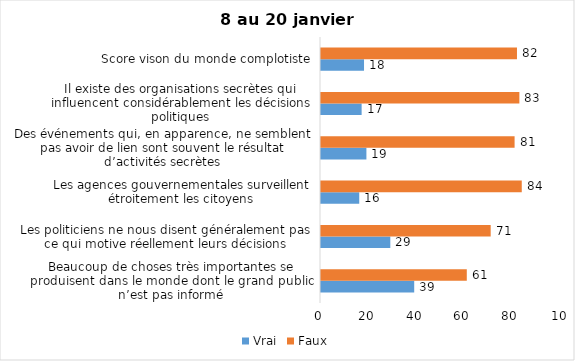
| Category | Vrai | Faux |
|---|---|---|
| Beaucoup de choses très importantes se produisent dans le monde dont le grand public n’est pas informé | 39 | 61 |
| Les politiciens ne nous disent généralement pas ce qui motive réellement leurs décisions | 29 | 71 |
| Les agences gouvernementales surveillent étroitement les citoyens | 16 | 84 |
| Des événements qui, en apparence, ne semblent pas avoir de lien sont souvent le résultat d’activités secrètes | 19 | 81 |
| Il existe des organisations secrètes qui influencent considérablement les décisions politiques | 17 | 83 |
| Score vison du monde complotiste | 18 | 82 |